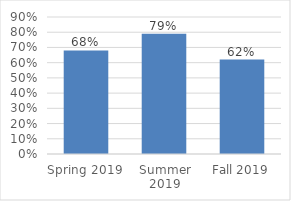
| Category | Series 0 |
|---|---|
| Spring 2019 | 0.68 |
| Summer 2019 | 0.79 |
| Fall 2019 | 0.62 |